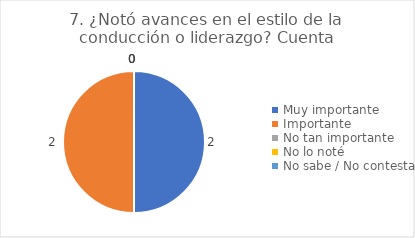
| Category | 7. ¿Notó avances en el estilo de la conducción o liderazgo? |
|---|---|
| Muy importante  | 0.5 |
| Importante  | 0.5 |
| No tan importante  | 0 |
| No lo noté  | 0 |
| No sabe / No contesta | 0 |